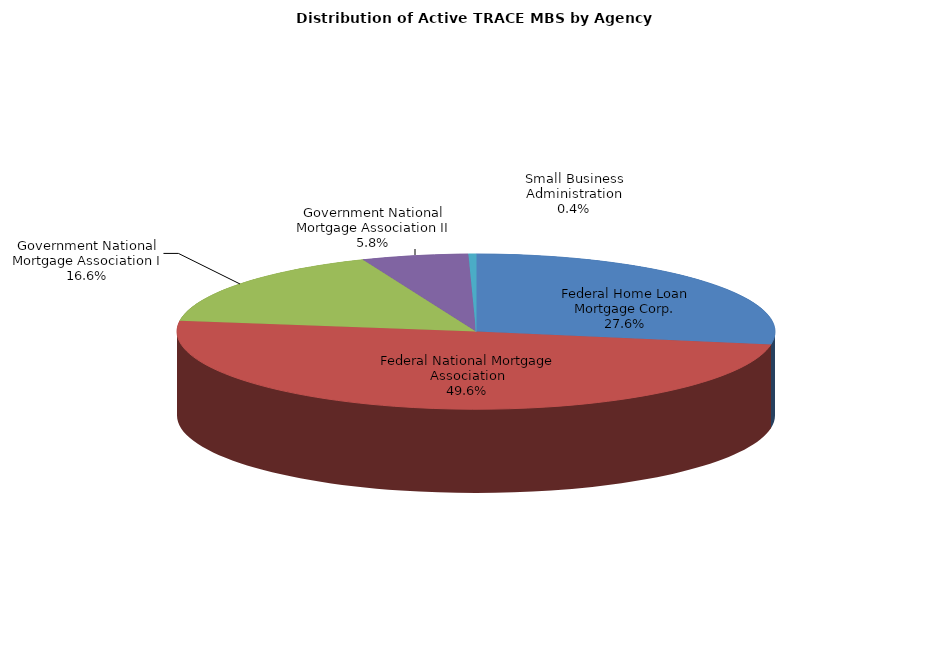
| Category | Series 0 |
|---|---|
| Federal Home Loan Mortgage Corp. | 294988 |
| Federal National Mortgage Association | 529131 |
| Government National Mortgage Association I | 177411 |
| Government National Mortgage Association II | 61511 |
| Small Business Administration | 4351 |